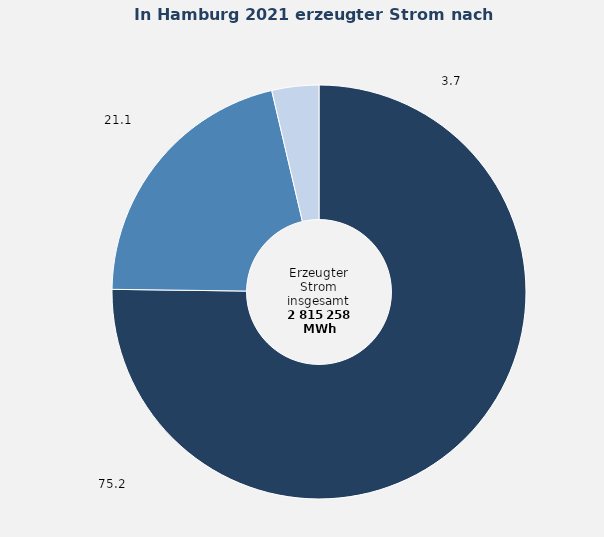
| Category | Anteil in Prozent |
|---|---|
| Fossile Energieträger | 75.206 |
| Erneuerbare Energien | 21.125 |
| Abfälle und sonstige Energieträger | 3.668 |